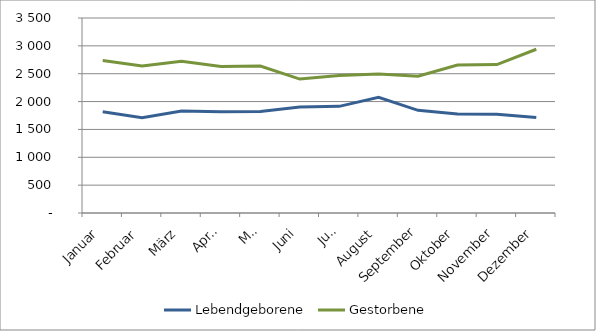
| Category | Lebendgeborene | Gestorbene |
|---|---|---|
| Januar | 1818 | 2737 |
| Februar | 1712 | 2639 |
| März | 1830 | 2722 |
| April | 1819 | 2628 |
| Mai | 1821 | 2639 |
| Juni | 1904 | 2404 |
| Juli | 1914 | 2466 |
| August | 2075 | 2495 |
| September | 1843 | 2454 |
| Oktober | 1779 | 2656 |
| November | 1774 | 2664 |
| Dezember | 1716 | 2939 |